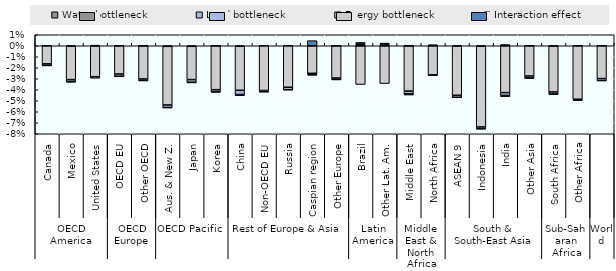
| Category | Interaction effect | Energy bottleneck | Land bottleneck | Water bottleneck |
|---|---|---|---|---|
| 0 | 0 | -0.016 | -0.001 | 0 |
| 1 | 0 | -0.031 | -0.002 | -0.001 |
| 2 | 0 | -0.028 | -0.001 | 0 |
| 3 | 0 | -0.026 | -0.002 | 0 |
| 4 | 0 | -0.03 | -0.001 | 0 |
| 5 | -0.001 | -0.053 | -0.002 | 0 |
| 6 | -0.001 | -0.03 | -0.002 | -0.001 |
| 7 | 0 | -0.04 | -0.002 | 0 |
| 8 | 0 | -0.04 | -0.004 | -0.001 |
| 9 | 0 | -0.041 | -0.001 | 0 |
| 10 | 0 | -0.038 | -0.002 | 0 |
| 11 | 0.005 | -0.025 | -0.001 | 0 |
| 12 | 0 | -0.029 | -0.001 | 0 |
| 13 | 0.001 | -0.035 | 0.001 | 0.001 |
| 14 | 0.001 | -0.034 | 0.001 | 0.001 |
| 15 | 0 | -0.041 | -0.002 | -0.001 |
| 16 | 0 | -0.026 | -0.001 | 0 |
| 17 | 0 | -0.045 | -0.002 | 0 |
| 18 | 0 | -0.073 | -0.002 | 0 |
| 19 | 0.001 | -0.043 | -0.003 | -0.001 |
| 20 | 0 | -0.027 | -0.002 | 0 |
| 21 | 0 | -0.042 | -0.002 | -0.001 |
| 22 | 0 | -0.049 | -0.001 | 0 |
| 23 | 0 | -0.03 | -0.002 | 0 |